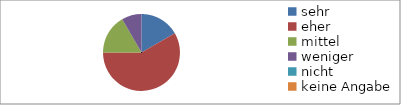
| Category | Series 0 |
|---|---|
| sehr | 2 |
| eher | 7 |
| mittel | 2 |
| weniger | 1 |
| nicht  | 0 |
| keine Angabe | 0 |